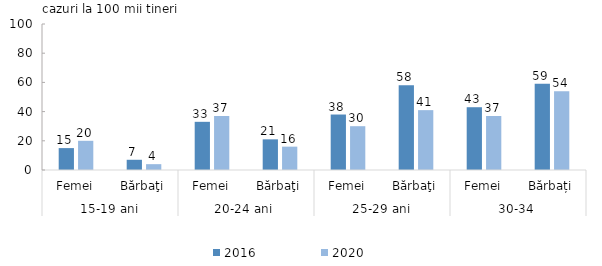
| Category | 2016 | 2020 |
|---|---|---|
| 0 | 15 | 20 |
| 1 | 7 | 4 |
| 2 | 33 | 37 |
| 3 | 21 | 16 |
| 4 | 38 | 30 |
| 5 | 58 | 41 |
| 6 | 43 | 37 |
| 7 | 59 | 54 |